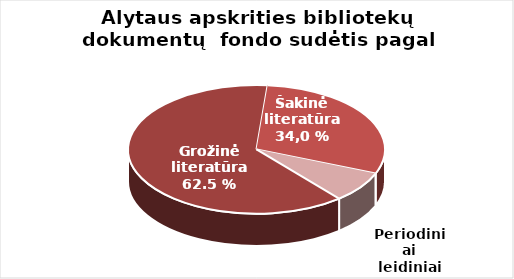
| Category | Series 0 |
|---|---|
| Grožinė literatūra* | 621474 |
| Šakinė literatūra* | 295931 |
| Periodiniai leidiniai | 77064 |